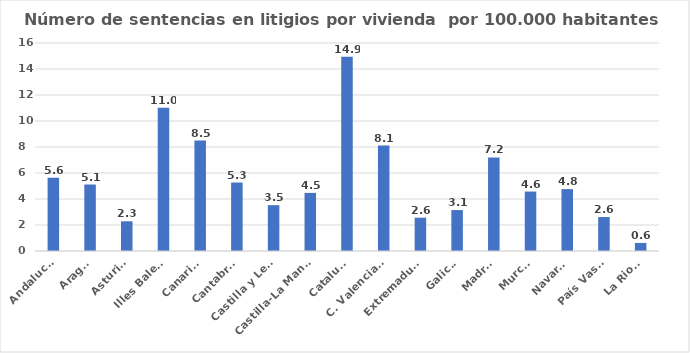
| Category | Número de sentencias en litigios por vivienda  por 100.000 habitantes |
|---|---|
| Andalucía | 5.626 |
| Aragón | 5.114 |
| Asturias | 2.285 |
| Illes Balears | 11.022 |
| Canarias | 8.496 |
| Cantabria | 5.267 |
| Castilla y León | 3.526 |
| Castilla-La Mancha | 4.47 |
| Cataluña | 14.938 |
| C. Valenciana | 8.106 |
| Extremadura | 2.561 |
| Galicia | 3.148 |
| Madrid | 7.198 |
| Murcia | 4.573 |
| Navarra | 4.76 |
| País Vasco | 2.613 |
| La Rioja | 0.621 |